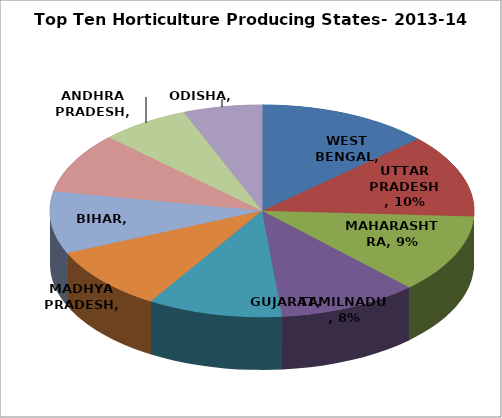
| Category | Series 0 |
|---|---|
| WEST BENGAL | 0.099 |
| UTTAR PRADESH | 0.095 |
| MAHARASHTRA | 0.09 |
| TAMILNADU | 0.08 |
| GUJARAT | 0.077 |
| MADHYA PRADESH | 0.073 |
| BIHAR | 0.071 |
| KARNATAKA | 0.069 |
| ANDHRA PRADESH | 0.051 |
| ODISHA | 0.045 |